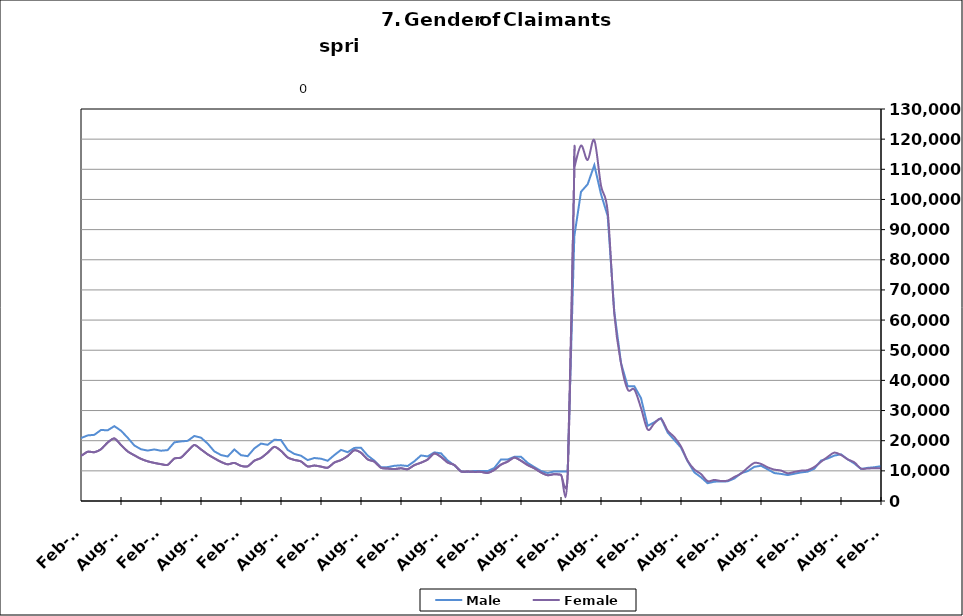
| Category | Male | Female |
|---|---|---|
| 1995-02-28 | 11910 | 7689 |
| 1995-03-31 | 12528 | 7887 |
| 1995-04-30 | 14119 | 8295 |
| 1995-05-31 | 15153 | 8659 |
| 1995-06-30 | 14654 | 9963 |
| 1995-07-31 | 16478 | 11435 |
| 1995-08-31 | 16264 | 11011 |
| 1995-09-30 | 13352 | 9104 |
| 1995-10-31 | 11499 | 8670 |
| 1995-11-30 | 10418 | 7960 |
| 1995-12-31 | 11010 | 7787 |
| 1996-01-31 | 11539 | 7863 |
| 1996-02-29 | 12768 | 7894 |
| 1996-03-31 | 13246 | 7755 |
| 1996-04-30 | 16021 | 8296 |
| 1996-05-31 | 15929 | 8751 |
| 1996-06-30 | 15291 | 10224 |
| 1996-07-31 | 17229 | 11535 |
| 1996-08-31 | 16317 | 10611 |
| 1996-09-30 | 13793 | 8812 |
| 1996-10-31 | 11431 | 8215 |
| 1996-11-30 | 10510 | 7751 |
| 1996-12-31 | 10023 | 7185 |
| 1997-01-31 | 12006 | 7404 |
| 1997-02-28 | 11976 | 7384 |
| 1997-03-31 | 11924 | 7078 |
| 1997-04-30 | 13098 | 7454 |
| 1997-05-31 | 13763 | 8032 |
| 1997-06-30 | 12872 | 9377 |
| 1997-07-31 | 15358 | 10550 |
| 1997-08-31 | 14888 | 9776 |
| 1997-09-30 | 12307 | 8016 |
| 1997-10-31 | 10749.5 | 7444 |
| 1997-11-30 | 9192 | 6872 |
| 1997-12-31 | 8541 | 6180 |
| 1998-01-31 | 9230 | 6563 |
| 1998-02-28 | 9286 | 6048 |
| 1998-03-31 | 9805 | 6012 |
| 1998-04-30 | 12254 | 7080 |
| 1998-05-31 | 13029 | 7509 |
| 1998-06-30 | 12376 | 9201 |
| 1998-07-31 | 14264 | 10448 |
| 1998-08-31 | 14319 | 9908 |
| 1998-09-30 | 12515 | 8202 |
| 1998-10-31 | 9927 | 7502 |
| 1998-11-30 | 9481 | 7563 |
| 1998-12-31 | 9422 | 7289 |
| 1999-01-31 | 10826 | 7829 |
| 1999-02-28 | 10614 | 7417 |
| 1999-03-31 | 10596 | 7180 |
| 1999-04-30 | 14139 | 8377 |
| 1999-05-31 | 14748 | 8508 |
| 1999-06-30 | 13399 | 9753 |
| 1999-07-31 | 16831 | 11294 |
| 1999-08-31 | 17466 | 10502 |
| 1999-09-30 | 14075 | 8356 |
| 1999-10-31 | 11344 | 7743 |
| 1999-11-30 | 10401 | 7623 |
| 1999-12-31 | 9702 | 6793 |
| 2000-01-31 | 10263 | 7252 |
| 2000-02-29 | 10217 | 7054 |
| 2000-03-31 | 10848 | 6860 |
| 2000-04-30 | 13099 | 8062 |
| 2000-05-31 | 13692 | 8388 |
| 2000-06-30 | 13498 | 10306 |
| 2000-07-31 | 15682 | 11874 |
| 2000-08-31 | 15407 | 10967 |
| 2000-09-30 | 12230 | 8808 |
| 2000-10-31 | 10182 | 8230 |
| 2000-11-30 | 9376 | 8049 |
| 2000-12-31 | 9229 | 7777 |
| 2001-01-31 | 10264 | 8400 |
| 2001-02-28 | 11709 | 8801 |
| 2001-03-31 | 9919 | 7036 |
| 2001-04-30 | 17255 | 11559 |
| 2001-05-31 | 18656 | 12219 |
| 2001-06-30 | 19590 | 15536 |
| 2001-07-31 | 22235 | 17388 |
| 2001-08-31 | 22550 | 16255 |
| 2001-09-30 | 20719 | 15193 |
| 2001-10-31 | 20761 | 15705 |
| 2001-11-30 | 22570 | 16084 |
| 2001-12-31 | 24429 | 16497 |
| 2002-01-31 | 26188 | 17125 |
| 2002-02-28 | 27071 | 16705 |
| 2002-03-31 | 26691 | 16475 |
| 2002-04-30 | 32125 | 20940 |
| 2002-05-31 | 31589 | 20115 |
| 2002-06-30 | 30220 | 21952 |
| 2002-07-31 | 30981 | 23132 |
| 2002-08-31 | 23858 | 16993 |
| 2002-09-30 | 27757 | 19832 |
| 2002-10-31 | 25023 | 18451 |
| 2002-11-30 | 24331 | 17763 |
| 2002-12-31 | 24361 | 17175 |
| 2003-01-31 | 24361 | 17175 |
| 2003-02-28 | 26133 | 17155 |
| 2003-03-31 | 26934 | 17491 |
| 2003-04-30 | 29393 | 19122 |
| 2003-05-31 | 30480 | 19811 |
| 2003-06-30 | 30177 | 22643 |
| 2003-07-31 | 30615 | 23565 |
| 2003-08-31 | 29860 | 22195 |
| 2003-09-30 | 26777 | 19925 |
| 2003-10-31 | 23899 | 18782 |
| 2003-11-30 | 22247 | 17944 |
| 2003-12-31 | 20902 | 16829 |
| 2004-01-31 | 20479 | 15794 |
| 2004-02-29 | 18869 | 14174 |
| 2004-03-31 | 18157 | 13452 |
| 2004-04-30 | 20525 | 14655 |
| 2004-05-31 | 20588 | 14975 |
| 2004-06-30 | 20148 | 17494 |
| 2004-07-31 | 22098 | 19064 |
| 2004-08-31 | 20778 | 16925 |
| 2004-09-30 | 17457 | 14258 |
| 2004-10-31 | 15548 | 13549 |
| 2004-11-30 | 14919 | 12836 |
| 2004-12-31 | 14200 | 11711 |
| 2005-01-31 | 14968 | 11918 |
| 2005-02-28 | 14478 | 11045 |
| 2005-03-31 | 13958 | 10426 |
| 2005-04-30 | 15898 | 11682 |
| 2005-05-31 | 16188 | 11900 |
| 2005-06-30 | 15549 | 14256 |
| 2005-07-31 | 16728 | 15274 |
| 2005-08-31 | 16418 | 13314 |
| 2005-09-30 | 12729 | 10857 |
| 2005-10-31 | 11493 | 10421 |
| 2005-11-30 | 10480 | 9638 |
| 2005-12-31 | 9482 | 8742 |
| 2006-01-31 | 9638 | 8761 |
| 2006-02-28 | 8844 | 7847 |
| 2006-03-31 | 9353 | 7709 |
| 2006-04-30 | 11916 | 9300 |
| 2006-05-31 | 12755 | 10017 |
| 2006-06-30 | 12840 | 12614 |
| 2006-07-31 | 14534 | 14007 |
| 2006-08-31 | 14510 | 12902 |
| 2006-09-30 | 12359 | 10850 |
| 2006-10-31 | 11360 | 10309 |
| 2006-11-30 | 10702 | 9403 |
| 2006-12-31 | 10886 | 9298 |
| 2007-01-31 | 11619 | 9539 |
| 2007-02-28 | 12137 | 9112 |
| 2007-03-31 | 12434 | 9125 |
| 2007-04-30 | 14864 | 10520 |
| 2007-05-31 | 16656 | 11730 |
| 2007-06-30 | 16711 | 14024 |
| 2007-07-31 | 18458 | 15882 |
| 2007-08-31 | 17879 | 14187 |
| 2007-09-30 | 16538 | 13586 |
| 2007-10-31 | 15458 | 13070 |
| 2007-11-15 | 14626 | 12172 |
| 2007-12-15 09:36:00 | 15625 | 12363 |
| 2008-01-14 19:12:00 | 17236 | 12936 |
| 2008-02-14 04:48:00 | 18262 | 12696 |
| 2008-03-15 14:24:00 | 19119 | 13263 |
| 2008-04-15 | 22039 | 15054 |
| 2008-05-15 09:36:00 | 24402 | 16733 |
| 2008-06-14 19:12:00 | 25155 | 19969 |
| 2008-07-15 04:48:00 | 27499 | 22268 |
| 2008-08-14 14:24:00 | 29286 | 21514 |
| 2008-09-14 | 30571 | 21776 |
| 2008-10-14 09:36:00 | 32282 | 22190 |
| 2008-11-13 19:12:00 | 36325 | 23395 |
| 2008-12-14 04:48:00 | 42012 | 25046 |
| 2009-01-13 14:24:00 | 49131 | 27148 |
| 2009-02-13 | 56509 | 29774 |
| 2009-03-15 09:36:00 | 63334 | 33788 |
| 2009-04-14 19:12:00 | 69062 | 36842 |
| 2009-05-15 04:48:00 | 69914 | 37773 |
| 2009-06-14 14:24:00 | 69512 | 42787 |
| 2009-07-15 | 71226 | 46347 |
| 2009-08-14 09:36:00 | 68777 | 43130 |
| 2009-09-13 19:12:00 | 65993 | 41526 |
| 2009-10-14 04:48:00 | 62480 | 40217 |
| 2009-11-13 14:24:00 | 60354 | 38454 |
| 2009-12-14 | 59507 | 36101 |
| 2010-01-13 09:36:00 | 58501 | 35014 |
| 2010-02-12 19:12:00 | 55590 | 32911 |
| 2010-03-15 04:48:00 | 53238 | 31883 |
| 2010-04-14 14:24:00 | 52264 | 32995 |
| 2010-05-15 | 50301 | 32394 |
| 2010-06-14 09:36:00 | 48130 | 36605 |
| 2010-07-14 19:12:00 | 48060 | 38748 |
| 2010-08-14 04:48:00 | 46311 | 35599 |
| 2010-09-13 14:24:00 | 41641 | 32453 |
| 2010-10-14 | 40403 | 32335 |
| 2010-11-13 09:36:00 | 38250 | 30275 |
| 2010-12-13 19:12:00 | 35858 | 26887 |
| 2011-01-13 04:48:00 | 37777 | 27522 |
| 2011-02-12 14:24:00 | 37515 | 26470 |
| 2011-03-15 | 35802 | 25248 |
| 2011-04-14 09:36:00 | 37452 | 26608 |
| 2011-05-14 19:12:00 | 37975 | 27212 |
| 2011-06-14 04:48:00 | 42289 | 36578 |
| 2011-07-14 14:24:00 | 42307 | 37061 |
| 2011-08-14 | 38125 | 31317 |
| 2011-09-13 09:36:00 | 34564 | 28090 |
| 2011-10-13 19:12:00 | 33146 | 27591 |
| 2011-11-13 04:48:00 | 31337 | 25538 |
| 2011-12-13 14:24:00 | 30334 | 23349 |
| 2012-01-13 | 31566 | 23385 |
| 2012-02-12 09:36:00 | 30859 | 22326 |
| 2012-03-13 19:12:00 | 29261 | 21568 |
| 2012-04-13 04:48:00 | 31494 | 22964 |
| 2012-05-13 14:24:00 | 32509 | 24284 |
| 2012-06-13 | 30900 | 27768 |
| 2012-07-13 09:36:00 | 33549 | 29756 |
| 2012-08-12 19:12:00 | 28663 | 24059 |
| 2012-09-12 04:48:00 | 25271 | 21482 |
| 2012-10-12 14:24:00 | 22730 | 20363 |
| 2012-11-12 | 19953 | 17450 |
| 2012-12-12 09:36:00 | 20635 | 16737 |
| 2013-01-11 19:12:00 | 22057 | 16712 |
| 2013-02-11 04:48:00 | 21486 | 15451 |
| 2013-03-13 14:24:00 | 20791 | 15186 |
| 2013-04-13 | 22409 | 16286 |
| 2013-05-13 09:36:00 | 24366 | 17794 |
| 2013-06-12 19:12:00 | 23573 | 20360 |
| 2013-07-13 04:48:00 | 25613 | 22369 |
| 2013-08-12 14:24:00 | 25420 | 20697 |
| 2013-09-12 | 22525 | 18385 |
| 2013-10-12 09:36:00 | 20848 | 17632 |
| 2013-11-11 19:12:00 | 20174 | 16466 |
| 2013-12-12 04:48:00 | 19765 | 15343 |
| 2014-01-11 14:24:00 | 20604 | 15183 |
| 2014-02-11 | 20864 | 15026 |
| 2014-03-13 09:36:00 | 21751 | 16343 |
| 2014-04-12 19:12:00 | 21948 | 16190 |
| 2014-05-13 04:48:00 | 23554 | 17163 |
| 2014-06-12 14:24:00 | 23446 | 19393 |
| 2014-07-13 | 24827 | 20751 |
| 2014-08-14 | 23315 | 18575 |
| 2014-09-13 09:36:00 | 20988 | 16453 |
| 2014-10-13 19:12:00 | 18411 | 15157 |
| 2014-11-13 04:48:00 | 17155 | 13975 |
| 2014-12-13 14:24:00 | 16727 | 13162 |
| 2015-01-13 | 17097 | 12633 |
| 2015-02-12 09:36:00 | 16674 | 12222 |
| 2015-03-14 19:12:00 | 16878 | 11988 |
| 2015-04-14 04:48:00 | 19448 | 14078 |
| 2015-05-14 14:24:00 | 19759 | 14413 |
| 2015-06-14 | 19952 | 16548 |
| 2015-07-14 09:36:00 | 21569 | 18572 |
| 2015-08-13 19:12:00 | 21001 | 17106 |
| 2015-09-13 04:48:00 | 19028 | 15475 |
| 2015-10-13 14:24:00 | 16459 | 14160 |
| 2015-11-13 | 15246 | 12968 |
| 2015-12-13 09:36:00 | 14756 | 12166 |
| 2016-01-12 19:12:00 | 17097 | 12633 |
| 2016-02-12 04:48:00 | 15198 | 11659 |
| 2016-03-13 14:24:00 | 14862 | 11506 |
| 2016-04-13 | 17432 | 13364 |
| 2016-05-13 09:36:00 | 19040 | 14264 |
| 2016-06-12 19:12:00 | 18628 | 16024 |
| 2016-07-13 04:48:00 | 20305 | 17959 |
| 2016-08-12 14:24:00 | 20204 | 16625 |
| 2016-09-12 | 16946 | 14443 |
| 2016-10-12 09:36:00 | 15612 | 13624 |
| 2016-11-11 19:12:00 | 15023 | 13122 |
| 2016-12-12 04:48:00 | 13560 | 11454 |
| 2017-01-11 14:24:00 | 14257 | 11754 |
| 2017-02-11 | 14028 | 11405 |
| 2017-03-13 09:36:00 | 13342 | 11038 |
| 2017-04-12 19:12:00 | 15225 | 12749 |
| 2017-05-13 04:48:00 | 16938 | 13582 |
| 2017-06-12 14:24:00 | 16188 | 14911 |
| 2017-07-13 | 17613 | 16845 |
| 2017-08-12 09:36:00 | 17640 | 16005 |
| 2017-09-11 19:12:00 | 15075 | 13806 |
| 2017-10-12 04:48:00 | 13384 | 13044 |
| 2017-11-11 14:24:00 | 11160 | 11015 |
| 2017-12-12 | 11238 | 10767 |
| 2018-01-11 09:36:00 | 11674 | 10594 |
| 2018-02-10 19:12:00 | 11835 | 10845 |
| 2018-03-13 04:48:00 | 11605 | 10548 |
| 2018-04-12 14:24:00 | 13162 | 11886 |
| 2018-05-13 | 15110 | 12712 |
| 2018-06-12 09:36:00 | 14782 | 13754 |
| 2018-07-12 19:12:00 | 16123 | 15773 |
| 2018-08-12 04:48:00 | 15808 | 14614 |
| 2018-09-11 14:24:00 | 13450 | 12761 |
| 2018-10-12 | 11831 | 11941 |
| 2018-11-11 09:36:00 | 9820 | 9821 |
| 2018-12-11 19:12:00 | 9649 | 9767 |
| 2019-01-11 04:48:00 | 9933 | 9654 |
| 2019-02-10 14:24:00 | 9925 | 9651 |
| 2019-03-13 | 9922 | 9318 |
| 2019-04-12 09:36:00 | 10950 | 10320 |
| 2019-05-12 19:12:00 | 13782 | 12072 |
| 2019-06-12 04:48:00 | 13767 | 13063 |
| 2019-07-12 14:24:00 | 14644 | 14409 |
| 2019-08-12 | 14678 | 13343 |
| 2019-09-11 09:36:00 | 12637 | 11915 |
| 2019-10-11 19:12:00 | 11254 | 10847 |
| 2019-11-11 04:48:00 | 9954 | 9467 |
| 2019-12-11 14:24:00 | 9289 | 8549 |
| 2020-01-11 | 9815 | 8911 |
| 2020-02-10 09:36:00 | 9754 | 8723 |
| 2020-03-11 19:12:00 | 9805 | 8802 |
| 2020-04-11 04:48:00 | 87837 | 110534 |
| 2020-05-11 14:24:00 | 102538 | 117856 |
| 2020-06-11 | 105039 | 113108 |
| 2020-07-11 09:36:00 | 111386 | 119644 |
| 2020-08-10 19:12:00 | 101758 | 104593 |
| 2020-09-10 04:48:00 | 94558 | 95979 |
| 2020-10-10 14:24:00 | 62680 | 62005 |
| 2020-11-10 | 45770 | 45707 |
| 2020-12-10 09:36:00 | 38071 | 36983 |
| 2021-01-09 19:12:00 | 38071 | 36983 |
| 2021-02-09 04:48:00 | 34126 | 30845 |
| 2021-03-11 14:24:00 | 24924 | 23717 |
| 2021-04-11 | 26116 | 25767 |
| 2021-05-11 09:36:00 | 27432 | 27279 |
| 2021-06-10 19:12:00 | 22711 | 23336 |
| 2021-07-11 04:48:00 | 20218 | 21201 |
| 2021-08-10 14:24:00 | 17708 | 18105 |
| 2021-09-10 | 13157 | 13319 |
| 2021-10-10 09:36:00 | 9494 | 10478 |
| 2021-11-09 19:12:00 | 7871 | 8942 |
| 2021-12-10 04:48:00 | 5889 | 6585 |
| 2022-01-09 14:24:00 | 6421 | 6988 |
| 2022-02-09 | 6439 | 6634 |
| 2022-03-11 09:36:00 | 6526 | 6780 |
| 2022-04-10 19:12:00 | 7456 | 7968 |
| 2022-05-11 04:48:00 | 9208 | 9103 |
| 2022-06-10 14:24:00 | 9908 | 11010 |
| 2022-07-11 | 11333 | 12637 |
| 2022-08-10 09:36:00 | 11684 | 12302 |
| 2022-09-09 19:12:00 | 10505 | 11164 |
| 2022-10-10 04:48:00 | 9269 | 10405 |
| 2022-11-09 14:24:00 | 8987 | 10105 |
| 2022-12-10 | 8606 | 9206 |
| 2023-01-09 09:36:00 | 9039 | 9648 |
| 2023-02-08 19:12:00 | 9477 | 10063 |
| 2023-03-11 04:48:00 | 9741 | 10250 |
| 2023-04-10 14:24:00 | 10705 | 11285 |
| 2023-05-11 | 13400 | 12988 |
| 2023-06-10 09:36:00 | 14103 | 14625 |
| 2023-07-10 19:12:00 | 15060 | 16045 |
| 2023-08-10 04:48:00 | 15475 | 15264 |
| 2023-09-09 14:24:00 | 13817 | 13818 |
| 2023-10-10 | 12438 | 12818 |
| 2023-11-09 09:36:00 | 10634 | 10753 |
| 2023-12-09 19:12:00 | 10984 | 10791 |
| 2024-01-09 04:48:00 | 11193 | 10858 |
| 2024-02-08 14:24:00 | 11545 | 10894 |